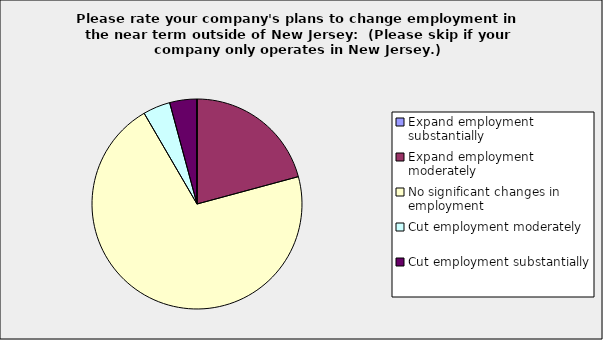
| Category | Series 0 |
|---|---|
| Expand employment substantially | 0 |
| Expand employment moderately | 0.208 |
| No significant changes in employment | 0.708 |
| Cut employment moderately | 0.042 |
| Cut employment substantially | 0.042 |